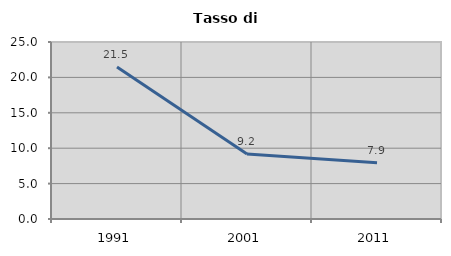
| Category | Tasso di disoccupazione   |
|---|---|
| 1991.0 | 21.484 |
| 2001.0 | 9.179 |
| 2011.0 | 7.937 |